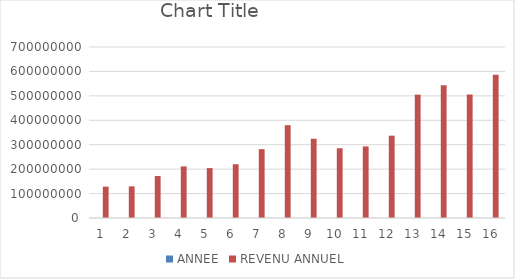
| Category | ANNEE | REVENU ANNUEL |
|---|---|---|
| 0 | 2005 | 128512000 |
| 1 | 2006 | 129435000 |
| 2 | 2007 | 171775135 |
| 3 | 2008 | 211216770 |
| 4 | 2009 | 204355626 |
| 5 | 2010 | 220085082 |
| 6 | 2011 | 281805744 |
| 7 | 2012 | 379994765 |
| 8 | 2013 | 324437000 |
| 9 | 2014 | 285456000 |
| 10 | 2015 | 293000000 |
| 11 | 2016 | 337000000 |
| 12 | 2017 | 505000000 |
| 13 | 2018 | 543700000 |
| 14 | 2019 | 505608000 |
| 15 | 2020 | 586259000 |